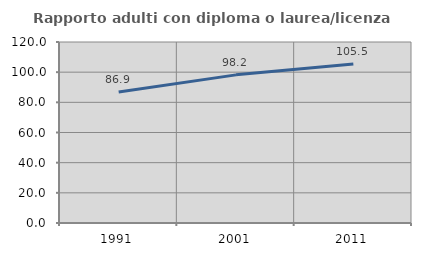
| Category | Rapporto adulti con diploma o laurea/licenza media  |
|---|---|
| 1991.0 | 86.869 |
| 2001.0 | 98.214 |
| 2011.0 | 105.455 |